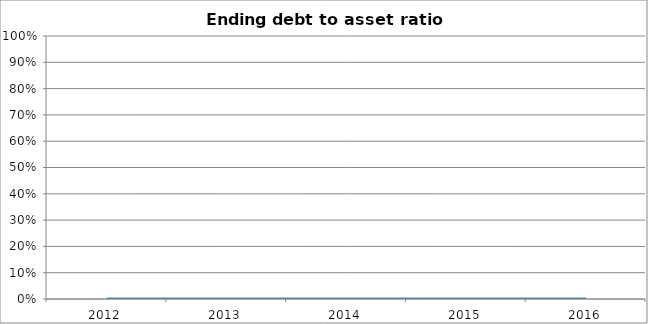
| Category | Ending debt to asset ratio [D/C] |
|---|---|
| 2012.0 | 0 |
| 2013.0 | 0 |
| 2014.0 | 0 |
| 2015.0 | 0 |
| 2016.0 | 0 |